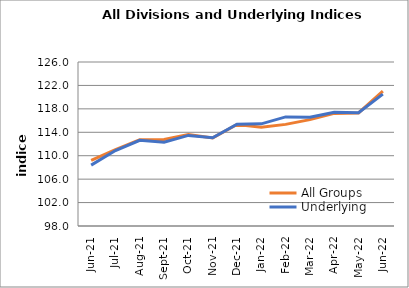
| Category | All Groups | Underlying |
|---|---|---|
| 2021-06-01 | 109.193 | 108.399 |
| 2021-07-01 | 111.039 | 110.883 |
| 2021-08-01 | 112.735 | 112.633 |
| 2021-09-01 | 112.778 | 112.306 |
| 2021-10-01 | 113.609 | 113.469 |
| 2021-11-01 | 113.04 | 113.069 |
| 2021-12-01 | 115.332 | 115.373 |
| 2022-01-01 | 114.841 | 115.444 |
| 2022-02-01 | 115.348 | 116.622 |
| 2022-03-01 | 116.161 | 116.584 |
| 2022-04-01 | 117.224 | 117.408 |
| 2022-05-01 | 117.307 | 117.327 |
| 2022-06-01 | 121.043 | 120.516 |